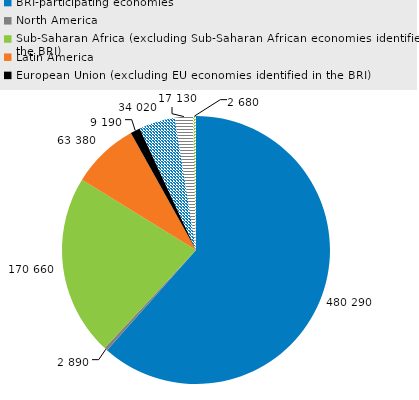
| Category | Series 0 |
|---|---|
| BRI-participating economies | 480290 |
| North America | 2890 |
| Sub-Saharan Africa (excluding Sub-Saharan African economies identified in the BRI) | 170660 |
| Latin America | 63380 |
| European Union (excluding EU economies identified in the BRI) | 9190 |
| Middle East & North Africa (excluding MENA economies identified in the BRI) | 34020 |
| Australia | 17130 |
| Other economies | 2680 |